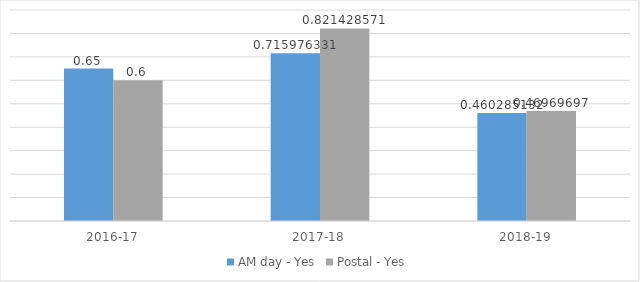
| Category | AM day - Yes | Postal - Yes |
|---|---|---|
| 2016-17 | 0.65 | 0.6 |
| 2017-18 | 0.716 | 0.821 |
| 2018-19 | 0.46 | 0.47 |